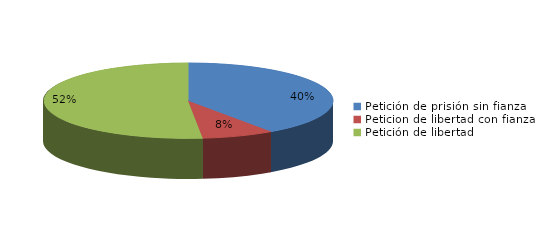
| Category | Series 0 |
|---|---|
| Petición de prisión sin fianza | 75 |
| Peticion de libertad con fianza | 15 |
| Petición de libertad | 96 |